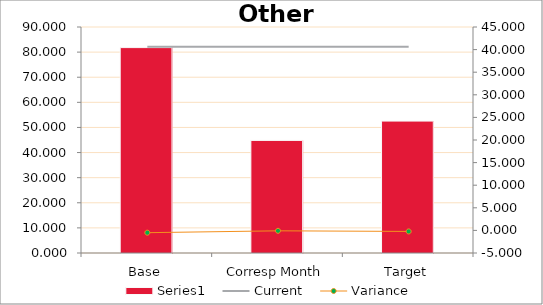
| Category | Series 0 |
|---|---|
| Base | 81.796 |
| Corresp Month | 44.84 |
| Target | 52.535 |